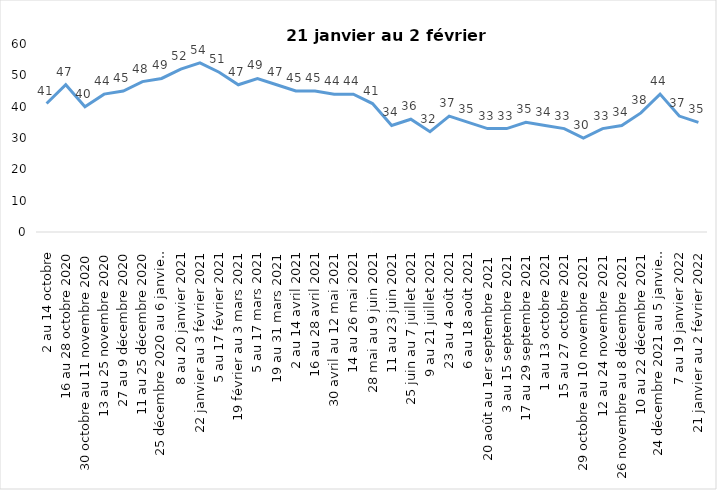
| Category | Toujours aux trois mesures |
|---|---|
| 2 au 14 octobre | 41 |
| 16 au 28 octobre 2020 | 47 |
| 30 octobre au 11 novembre 2020 | 40 |
| 13 au 25 novembre 2020 | 44 |
| 27 au 9 décembre 2020 | 45 |
| 11 au 25 décembre 2020 | 48 |
| 25 décembre 2020 au 6 janvier 2021 | 49 |
| 8 au 20 janvier 2021 | 52 |
| 22 janvier au 3 février 2021 | 54 |
| 5 au 17 février 2021 | 51 |
| 19 février au 3 mars 2021 | 47 |
| 5 au 17 mars 2021 | 49 |
| 19 au 31 mars 2021 | 47 |
| 2 au 14 avril 2021 | 45 |
| 16 au 28 avril 2021 | 45 |
| 30 avril au 12 mai 2021 | 44 |
| 14 au 26 mai 2021 | 44 |
| 28 mai au 9 juin 2021 | 41 |
| 11 au 23 juin 2021 | 34 |
| 25 juin au 7 juillet 2021 | 36 |
| 9 au 21 juillet 2021 | 32 |
| 23 au 4 août 2021 | 37 |
| 6 au 18 août 2021 | 35 |
| 20 août au 1er septembre 2021 | 33 |
| 3 au 15 septembre 2021 | 33 |
| 17 au 29 septembre 2021 | 35 |
| 1 au 13 octobre 2021 | 34 |
| 15 au 27 octobre 2021 | 33 |
| 29 octobre au 10 novembre 2021 | 30 |
| 12 au 24 novembre 2021 | 33 |
| 26 novembre au 8 décembre 2021 | 34 |
| 10 au 22 décembre 2021 | 38 |
| 24 décembre 2021 au 5 janvier 2022 2022 | 44 |
| 7 au 19 janvier 2022 | 37 |
| 21 janvier au 2 février 2022 | 35 |